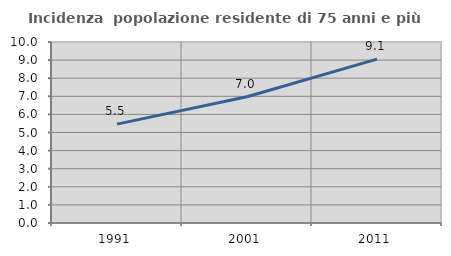
| Category | Incidenza  popolazione residente di 75 anni e più |
|---|---|
| 1991.0 | 5.464 |
| 2001.0 | 6.978 |
| 2011.0 | 9.055 |